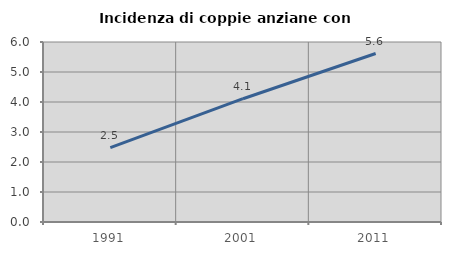
| Category | Incidenza di coppie anziane con figli |
|---|---|
| 1991.0 | 2.479 |
| 2001.0 | 4.11 |
| 2011.0 | 5.616 |